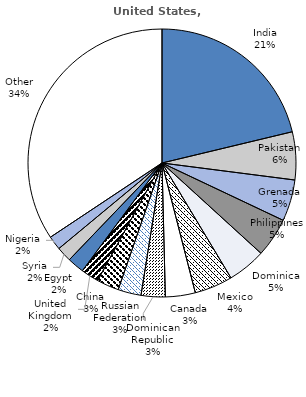
| Category | United States, 2016 |
|---|---|
| India | 45830 |
| Pakistan | 12454 |
| Grenada | 10789 |
| Philippines | 10217 |
| Dominica | 9974 |
| Mexico | 9923 |
| Canada | 7765 |
| Dominican Republic | 6269 |
| Russian Federation | 6021 |
| China | 5772 |
| United Kingdom | 4635 |
| Egypt | 4379 |
| Syria | 3922 |
| Nigeria | 3634 |
| Other | 74046 |